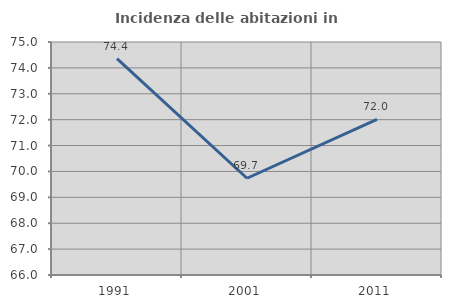
| Category | Incidenza delle abitazioni in proprietà  |
|---|---|
| 1991.0 | 74.355 |
| 2001.0 | 69.737 |
| 2011.0 | 72.011 |